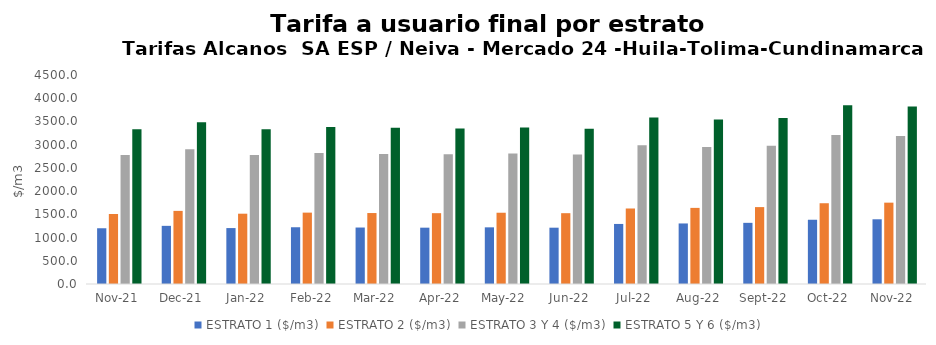
| Category | ESTRATO 1 ($/m3) | ESTRATO 2 ($/m3) | ESTRATO 3 Y 4 ($/m3) | ESTRATO 5 Y 6 ($/m3) |
|---|---|---|---|---|
| 2021-11-01 | 1200.29 | 1507.63 | 2775.81 | 3330.972 |
| 2021-12-01 | 1252.11 | 1574.14 | 2902.39 | 3482.868 |
| 2022-01-01 | 1204.22 | 1513.73 | 2778.76 | 3334.512 |
| 2022-02-01 | 1221.94 | 1536.68 | 2818.77 | 3382.524 |
| 2022-03-01 | 1215.9 | 1527.93 | 2801.57 | 3361.884 |
| 2022-04-01 | 1212.81 | 1525 | 2791.83 | 3350.196 |
| 2022-05-01 | 1219.94 | 1534.44 | 2808.77 | 3370.524 |
| 2022-06-01 | 1212.49 | 1524.79 | 2787.21 | 3344.652 |
| 2022-07-01 | 1293.01 | 1625.8 | 2986.65 | 3583.98 |
| 2022-08-01 | 1303.53 | 1638.87 | 2951.9 | 3542.28 |
| 2022-09-01 | 1316.79 | 1655.76 | 2979.32 | 3575.184 |
| 2022-10-01 | 1383.39 | 1739.03 | 3208.12 | 3849.744 |
| 2022-11-01 | 1393.41 | 1751.52 | 3185.9 | 3823.08 |